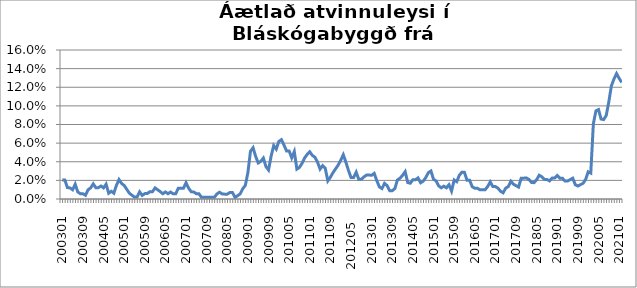
| Category | Series 0 |
|---|---|
| 200301 | 0.02 |
| 200302 | 0.02 |
| 200303 | 0.012 |
| 200304 | 0.012 |
| 200305 | 0.01 |
| 200306 | 0.016 |
| 200307 | 0.008 |
| 200308 | 0.006 |
| 200309 | 0.006 |
| 200310 | 0.004 |
| 200311 | 0.01 |
| 200312 | 0.012 |
| 200401 | 0.016 |
| 200402 | 0.012 |
| 200403 | 0.012 |
| 200404 | 0.014 |
| 200405 | 0.012 |
| 200406 | 0.016 |
| 200407 | 0.006 |
| 200408 | 0.008 |
| 200409 | 0.006 |
| 200410 | 0.015 |
| 200411 | 0.021 |
| 200412 | 0.017 |
| 200501 | 0.015 |
| 200502 | 0.01 |
| 200503 | 0.006 |
| 200504 | 0.004 |
| 200505 | 0.002 |
| 200506 | 0.002 |
| 200507 | 0.008 |
| 200508 | 0.004 |
| 200509 | 0.006 |
| 200510 | 0.006 |
| 200511 | 0.008 |
| 200512 | 0.008 |
| 200601 | 0.012 |
| 200602 | 0.01 |
| 200603 | 0.008 |
| 200604 | 0.006 |
| 200605 | 0.008 |
| 200606 | 0.006 |
| 200607 | 0.007 |
| 200608 | 0.006 |
| 200609 | 0.006 |
| 200610 | 0.012 |
| 200611 | 0.012 |
| 200612 | 0.012 |
| 200701 | 0.017 |
| 200702 | 0.012 |
| 200703 | 0.008 |
| 200704 | 0.008 |
| 200705 | 0.006 |
| 200706 | 0.006 |
| 200707 | 0.002 |
| 200708 | 0.002 |
| 200709 | 0.002 |
| 200710 | 0.002 |
| 200711 | 0.002 |
| 200712 | 0.002 |
| 200801 | 0.005 |
| 200802 | 0.007 |
| 200803 | 0.005 |
| 200804 | 0.005 |
| 200805 | 0.005 |
| 200806 | 0.007 |
| 200807 | 0.007 |
| 200808 | 0.002 |
| 200809 | 0.004 |
| 200810 | 0.005 |
| 200811 | 0.011 |
| 200812 | 0.015 |
| 200901 | 0.028 |
| 200902 | 0.051 |
| 200903 | 0.055 |
| 200904 | 0.046 |
| 200905 | 0.039 |
| 200906 | 0.04 |
| 200907 | 0.044 |
| 200908 | 0.035 |
| 200909 | 0.031 |
| 200910 | 0.046 |
| 200911 | 0.057 |
| 200912 | 0.054 |
| 201001 | 0.062 |
| 201002 | 0.064 |
| 201003 | 0.058 |
| 201004 | 0.052 |
| 201005 | 0.052 |
| 201006 | 0.044 |
| 201007 | 0.051 |
| 201008 | 0.032 |
| 201009 | 0.034 |
| 201010 | 0.038 |
| 201011 | 0.044 |
| 201012 | 0.048 |
| 201101 | 0.051 |
| 201102 | 0.047 |
| 201103 | 0.045 |
| 201104 | 0.04 |
| 201105 | 0.032 |
| 201106 | 0.036 |
| 201107 | 0.033 |
| 201108 | 0.019 |
| 201109 | 0.023 |
| 201110 | 0.028 |
| 201111 | 0.032 |
| 201112 | 0.036 |
| 201201  | 0.042 |
| 201202  | 0.048 |
| 201203  | 0.04 |
| 201204  | 0.031 |
| 201205  | 0.023 |
| 201206  | 0.023 |
| 201207  | 0.029 |
| 201208  | 0.021 |
| 201209  | 0.021 |
| 201210  | 0.024 |
| 201211  | 0.026 |
| 201212  | 0.026 |
| 201301 | 0.026 |
| 201302 | 0.028 |
| 201303 | 0.02 |
| 201304 | 0.013 |
| 201305 | 0.011 |
| 201306 | 0.017 |
| 201307 | 0.014 |
| 201308 | 0.009 |
| 201309 | 0.009 |
| 201310 | 0.011 |
| 201311 | 0.02 |
| 201312 | 0.022 |
| 201401 | 0.025 |
| 201402 | 0.029 |
| 201403 | 0.018 |
| 201404 | 0.017 |
| 201405 | 0.021 |
| 201406 | 0.021 |
| 201407 | 0.023 |
| 201408 | 0.017 |
| 201409 | 0.019 |
| 201410 | 0.023 |
| 201411 | 0.028 |
| 201412 | 0.03 |
| 201501 | 0.021 |
| 201502 | 0.019 |
| 201503 | 0.014 |
| 201504 | 0.012 |
| 201505 | 0.014 |
| 201506 | 0.012 |
| 201507 | 0.015 |
| 201508 | 0.009 |
| 201509 | 0.02 |
| 201510 | 0.019 |
| 201511 | 0.025 |
| 201512 | 0.029 |
| 201601 | 0.029 |
| 201602 | 0.02 |
| 201603 | 0.02 |
| 201604 | 0.013 |
| 201605 | 0.012 |
| 201606 | 0.012 |
| 201607 | 0.01 |
| 201608 | 0.01 |
| 201609 | 0.01 |
| 201610 | 0.013 |
| 201611 | 0.018 |
| 201612 | 0.013 |
| 201701 | 0.013 |
| 201702 | 0.012 |
| 201703 | 0.008 |
| 201704 | 0.007 |
| 201705 | 0.012 |
| 201706 | 0.013 |
| 201707 | 0.019 |
| 201708 | 0.016 |
| 201709 | 0.014 |
| 201710 | 0.013 |
| 201711 | 0.022 |
| 201712 | 0.022 |
| 201801 | 0.023 |
| 201802 | 0.021 |
| 201803 | 0.018 |
| 201804 | 0.018 |
| 201805 | 0.021 |
| 201806 | 0.026 |
| 201807 | 0.024 |
| 201808 | 0.021 |
| 201809 | 0.021 |
| 201810 | 0.019 |
| 201811 | 0.022 |
| 201812 | 0.022 |
| 201901 | 0.025 |
| 201902 | 0.022 |
| 201903 | 0.022 |
| 201904 | 0.019 |
| 201905 | 0.019 |
| 201906 | 0.021 |
| 201907 | 0.022 |
| 201908 | 0.015 |
| 201909 | 0.014 |
| 201910 | 0.015 |
| 201911 | 0.017 |
| 201912 | 0.021 |
| 202001 | 0.029 |
| 202002 | 0.028 |
| 202003 | 0.081 |
| 202004 | 0.095 |
| 202005 | 0.096 |
| 202006 | 0.086 |
| 202007 | 0.085 |
| 202008 | 0.09 |
| 202009 | 0.104 |
| 202010 | 0.122 |
| 202011 | 0.129 |
| 202012 | 0.135 |
| 202101 | 0.13 |
| 202102 | 0.125 |